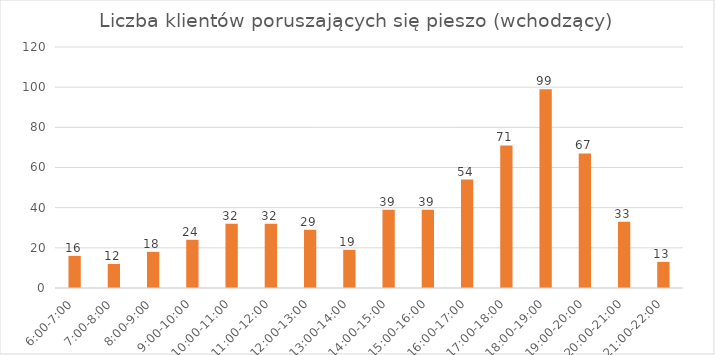
| Category | Wchodzący |
|---|---|
| 6:00-7:00 | 16 |
| 7:00-8:00 | 12 |
| 8:00-9:00 | 18 |
| 9:00-10:00 | 24 |
| 10:00-11:00 | 32 |
| 11:00-12:00 | 32 |
| 12:00-13:00 | 29 |
| 13:00-14:00 | 19 |
| 14:00-15:00 | 39 |
| 15:00-16:00 | 39 |
| 16:00-17:00 | 54 |
| 17:00-18:00 | 71 |
| 18:00-19:00 | 99 |
| 19:00-20:00 | 67 |
| 20:00-21:00 | 33 |
| 21:00-22:00 | 13 |